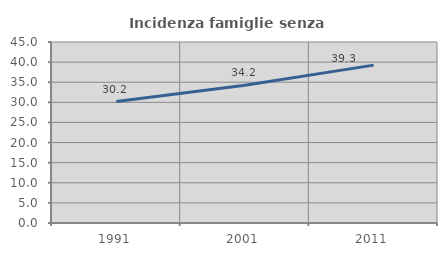
| Category | Incidenza famiglie senza nuclei |
|---|---|
| 1991.0 | 30.205 |
| 2001.0 | 34.239 |
| 2011.0 | 39.252 |